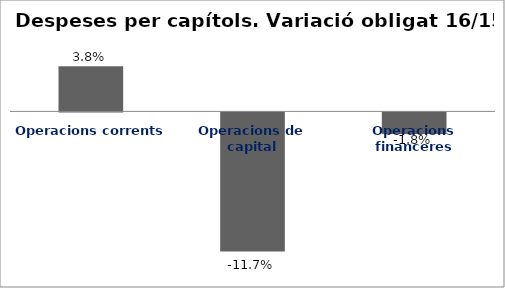
| Category | Series 0 |
|---|---|
| Operacions corrents | 0.038 |
| Operacions de capital | -0.117 |
| Operacions financeres | -0.018 |